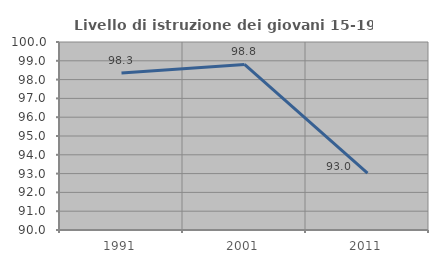
| Category | Livello di istruzione dei giovani 15-19 anni |
|---|---|
| 1991.0 | 98.347 |
| 2001.0 | 98.81 |
| 2011.0 | 93.023 |